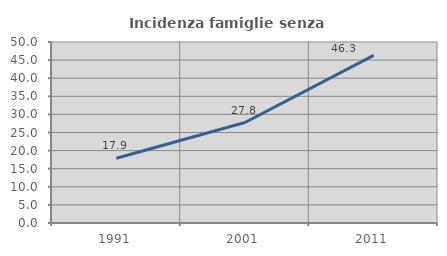
| Category | Incidenza famiglie senza nuclei |
|---|---|
| 1991.0 | 17.888 |
| 2001.0 | 27.762 |
| 2011.0 | 46.316 |